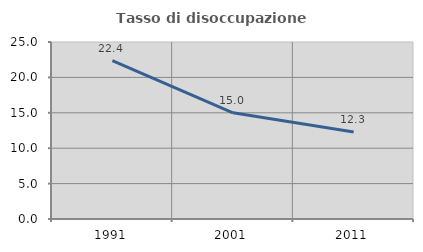
| Category | Tasso di disoccupazione giovanile  |
|---|---|
| 1991.0 | 22.359 |
| 2001.0 | 15 |
| 2011.0 | 12.281 |